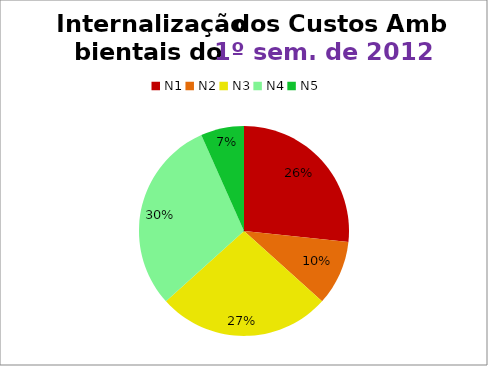
| Category | 1º/12 |
|---|---|
| N1 | 8 |
| N2 | 3 |
| N3 | 8 |
| N4 | 9 |
| N5 | 2 |